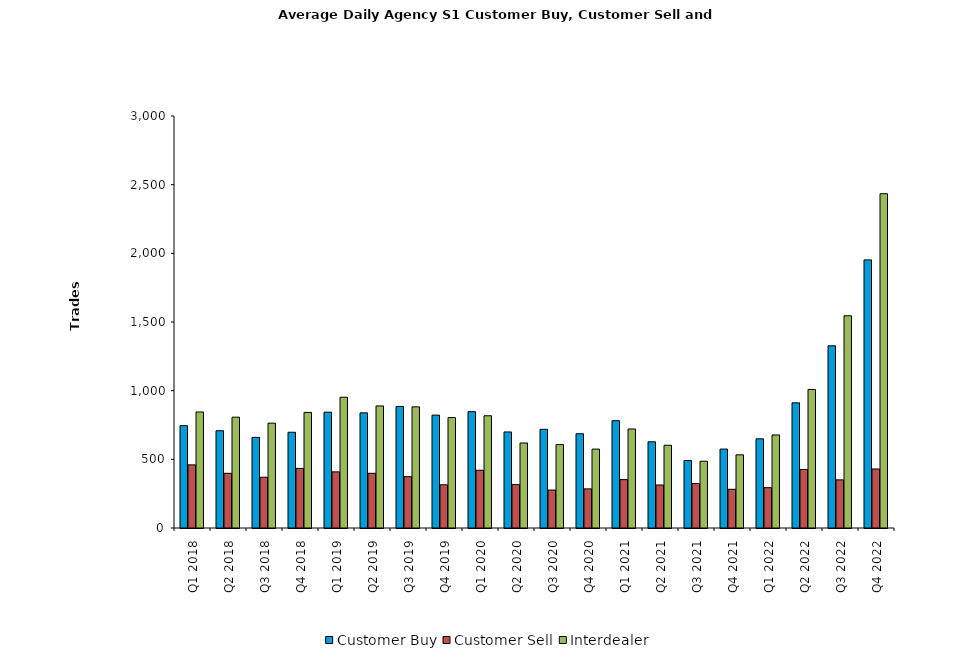
| Category | Customer Buy | Customer Sell | Interdealer |
|---|---|---|---|
| Q1 2018 | 745.098 | 459.869 | 844.754 |
| Q2 2018 | 708.406 | 398.219 | 806.812 |
| Q3 2018 | 659.667 | 369.762 | 763.397 |
| Q4 2018 | 697.19 | 434.127 | 841.746 |
| Q1 2019 | 843.295 | 408.787 | 952.246 |
| Q2 2019 | 838.492 | 398.349 | 888.746 |
| Q3 2019 | 884.844 | 373.766 | 882.172 |
| Q4 2019 | 821.906 | 314.656 | 804 |
| Q1 2020 | 847.161 | 420.581 | 817.339 |
| Q2 2020 | 699.365 | 315.984 | 619.127 |
| Q3 2020 | 718.391 | 276.359 | 607.312 |
| Q4 2020 | 686.266 | 284.797 | 574.438 |
| Q1 2021 | 781.328 | 352.377 | 721.082 |
| Q2 2021 | 627.587 | 313.111 | 602.508 |
| Q3 2021 | 491 | 323.672 | 486.188 |
| Q4 2021 | 574.609 | 281.906 | 532.891 |
| Q1 2022 | 649.323 | 293.629 | 677.516 |
| Q2 2022 | 911.403 | 426.532 | 1008.855 |
| Q3 2022 | 1326.641 | 350.516 | 1545.344 |
| Q4 2022 | 1952.317 | 429.825 | 2434.175 |